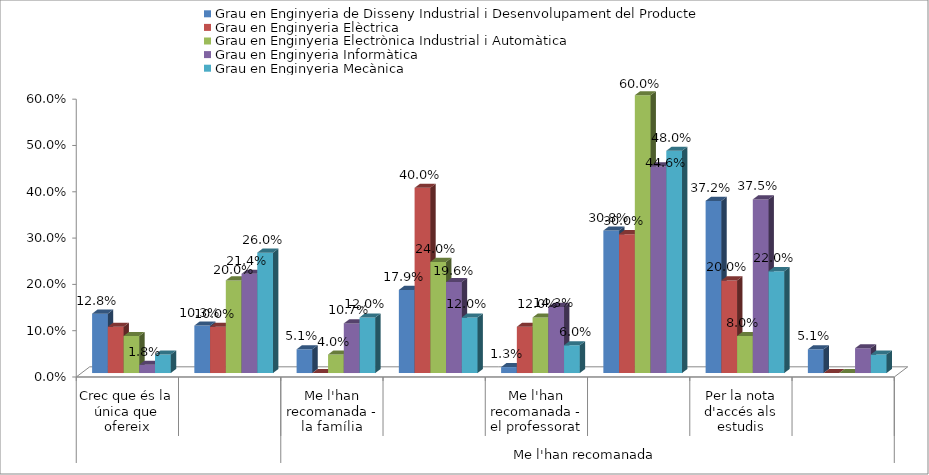
| Category | Grau en Enginyeria de Disseny Industrial i Desenvolupament del Producte | Grau en Enginyeria Elèctrica | Grau en Enginyeria Electrònica Industrial i Automàtica | Grau en Enginyeria Informàtica | Grau en Enginyeria Mecànica |
|---|---|---|---|---|---|
| 0 | 0.128 | 0.1 | 0.08 | 0.018 | 0.04 |
| 1 | 0.103 | 0.1 | 0.2 | 0.214 | 0.26 |
| 2 | 0.051 | 0 | 0.04 | 0.107 | 0.12 |
| 3 | 0.179 | 0.4 | 0.24 | 0.196 | 0.12 |
| 4 | 0.013 | 0.1 | 0.12 | 0.143 | 0.06 |
| 5 | 0.308 | 0.3 | 0.6 | 0.446 | 0.48 |
| 6 | 0.372 | 0.2 | 0.08 | 0.375 | 0.22 |
| 7 | 0.051 | 0 | 0 | 0.054 | 0.04 |